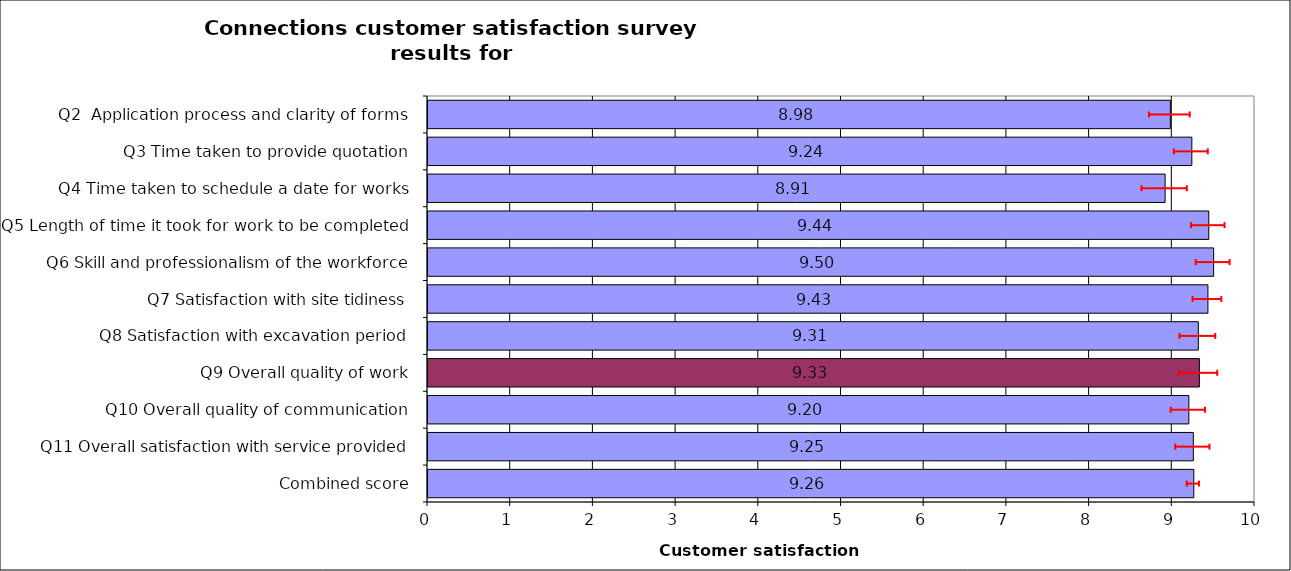
| Category | Series 0 |
|---|---|
| Q2  Application process and clarity of forms | 8.976 |
| Q3 Time taken to provide quotation | 9.236 |
| Q4 Time taken to schedule a date for works | 8.913 |
| Q5 Length of time it took for work to be completed | 9.441 |
| Q6 Skill and professionalism of the workforce | 9.5 |
| Q7 Satisfaction with site tidiness | 9.431 |
| Q8 Satisfaction with excavation period | 9.315 |
| Q9 Overall quality of work | 9.327 |
| Q10 Overall quality of communication | 9.2 |
| Q11 Overall satisfaction with service provided | 9.254 |
| Combined score | 9.26 |